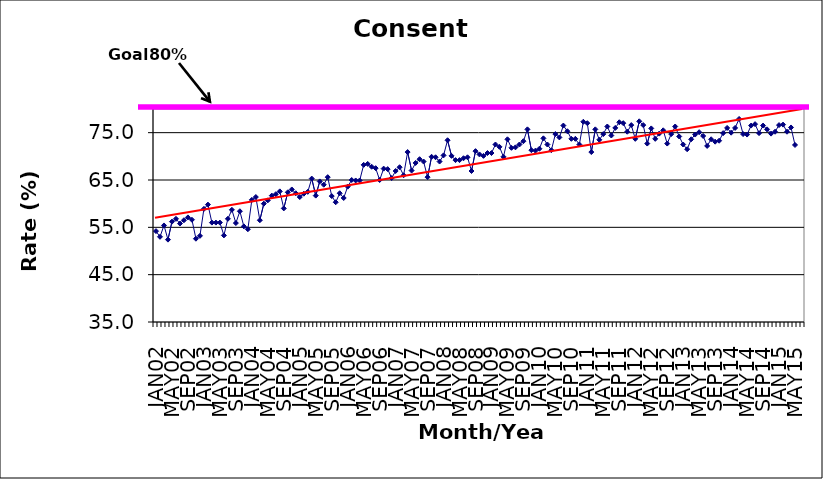
| Category | Series 0 |
|---|---|
| JAN02 | 54.2 |
| FEB02 | 53 |
| MAR02 | 55.4 |
| APR02 | 52.4 |
| MAY02 | 56.2 |
| JUN02 | 56.8 |
| JUL02 | 55.8 |
| AUG02 | 56.5 |
| SEP02 | 57.1 |
| OCT02 | 56.6 |
| NOV02 | 52.6 |
| DEC02 | 53.2 |
| JAN03 | 58.9 |
| FEB03 | 59.8 |
| MAR03 | 56 |
| APR03 | 56 |
| MAY03 | 56 |
| JUN03 | 53.3 |
| JUL03 | 56.8 |
| AUG03 | 58.7 |
| SEP03 | 55.9 |
| OCT03 | 58.4 |
| NOV03 | 55.2 |
| DEC03 | 54.6 |
| JAN04 | 60.8 |
| FEB04 | 61.4 |
| MAR04 | 56.5 |
| APR04 | 60 |
| MAY04 | 60.7 |
| JUN04 | 61.7 |
| JUL04 | 62 |
| AUG04 | 62.6 |
| SEP04 | 59 |
| OCT04 | 62.4 |
| NOV04 | 63 |
| DEC04 | 62.2 |
| JAN05 | 61.4 |
| FEB05 | 62.1 |
| MAR05 | 62.5 |
| APR05 | 65.3 |
| MAY05 | 61.7 |
| JUN05 | 64.7 |
| JUL05 | 64 |
| AUG05 | 65.6 |
| SEP05 | 61.6 |
| OCT05 | 60.3 |
| NOV05 | 62.2 |
| DEC05 | 61.2 |
| JAN06 | 63.6 |
| FEB06 | 65 |
| MAR06 | 64.9 |
| APR06 | 64.9 |
| MAY06 | 68.2 |
| JUN06 | 68.4 |
| JUL06 | 67.8 |
| AUG06 | 67.5 |
| SEP06 | 65 |
| OCT06 | 67.4 |
| NOV06 | 67.3 |
| DEC06 | 65.4 |
| JAN07 | 66.9 |
| FEB07 | 67.7 |
| MAR07 | 66 |
| APR07 | 70.9 |
| MAY07 | 67 |
| JUN07 | 68.6 |
| JUL07 | 69.4 |
| AUG07 | 68.9 |
| SEP07 | 65.6 |
| OCT07 | 69.9 |
| NOV07 | 69.8 |
| DEC07 | 68.9 |
| JAN08 | 70.2 |
| FEB08 | 73.4 |
| MAR08 | 70.1 |
| APR08 | 69.2 |
| MAY08 | 69.2 |
| JUN08 | 69.6 |
| JUL08 | 69.8 |
| AUG08 | 66.9 |
| SEP08 | 71.1 |
| OCT08 | 70.4 |
| NOV08 | 70.1 |
| DEC08 | 70.7 |
| JAN09 | 70.7 |
| FEB09 | 72.5 |
| MAR09 | 72 |
| APR09 | 69.9 |
| MAY09 | 73.6 |
| JUN09 | 71.8 |
| JUL09 | 71.9 |
| AUG09 | 72.5 |
| SEP09 | 73.2 |
| OCT09 | 75.7 |
| NOV09 | 71.3 |
| DEC09 | 71.2 |
| JAN10 | 71.6 |
| FEB10 | 73.8 |
| MAR10 | 72.5 |
| APR10 | 71.3 |
| MAY10 | 74.7 |
| JUN10 | 74 |
| JUL10 | 76.5 |
| AUG10 | 75.3 |
| SEP10 | 73.7 |
| OCT10 | 73.7 |
| NOV10 | 72.5 |
| DEC10 | 77.3 |
| JAN11 | 77 |
| FEB11 | 70.9 |
| MAR11 | 75.7 |
| APR11 | 73.5 |
| MAY11 | 74.7 |
| JUN11 | 76.3 |
| JUL11 | 74.4 |
| AUG11 | 76 |
| SEP11 | 77.2 |
| OCT11 | 77 |
| NOV11 | 75.2 |
| DEC11 | 76.6 |
| JAN12 | 73.7 |
| FEB12 | 77.4 |
| MAR12 | 76.6 |
| APR12 | 72.7 |
| MAY12 | 75.9 |
| JUN12 | 73.7 |
| JUL12 | 74.8 |
| AUG12 | 75.5 |
| SEP12 | 72.7 |
| OCT12 | 74.7 |
| NOV12 | 76.3 |
| DEC12 | 74.2 |
| JAN13 | 72.5 |
| FEB13 | 71.5 |
| MAR13 | 73.6 |
| APR13 | 74.6 |
| MAY13 | 75.1 |
| JUN13 | 74.3 |
| JUL13 | 72.2 |
| AUG13 | 73.6 |
| SEP13 | 73.1 |
| OCT13 | 73.3 |
| NOV13 | 74.9 |
| DEC13 | 76 |
| JAN14 | 75 |
| FEB14 | 76 |
| MAR14 | 77.9 |
| APR14 | 74.7 |
| MAY14 | 74.6 |
| JUN14 | 76.5 |
| JUL14 | 76.8 |
| AUG14 | 74.9 |
| SEP14 | 76.5 |
| OCT14 | 75.7 |
| NOV14 | 74.8 |
| DEC14 | 75.2 |
| JAN15 | 76.6 |
| FEB15 | 76.7 |
| MAR15 | 75.2 |
| APR15 | 76.1 |
| MAY15 | 72.4 |